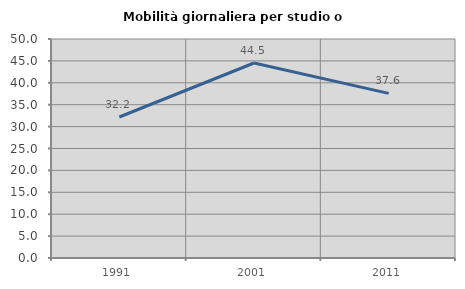
| Category | Mobilità giornaliera per studio o lavoro |
|---|---|
| 1991.0 | 32.195 |
| 2001.0 | 44.521 |
| 2011.0 | 37.594 |